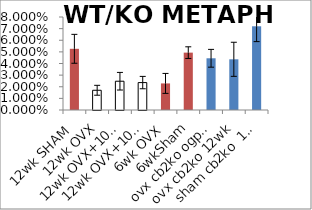
| Category | Series 1 |
|---|---|
| 12wk SHAM | 0.053 |
| 12wk OVX | 0.017 |
| 12wk OVX+10ng OGP | 0.025 |
| 12wk OVX+100ng OGP | 0.024 |
| 6wk OVX | 0.023 |
| 6wkSham | 0.049 |
| ovx cb2ko ogp 12wk | 0.044 |
| ovx cb2ko 12wk | 0.044 |
| sham cb2ko  12wk | 0.072 |